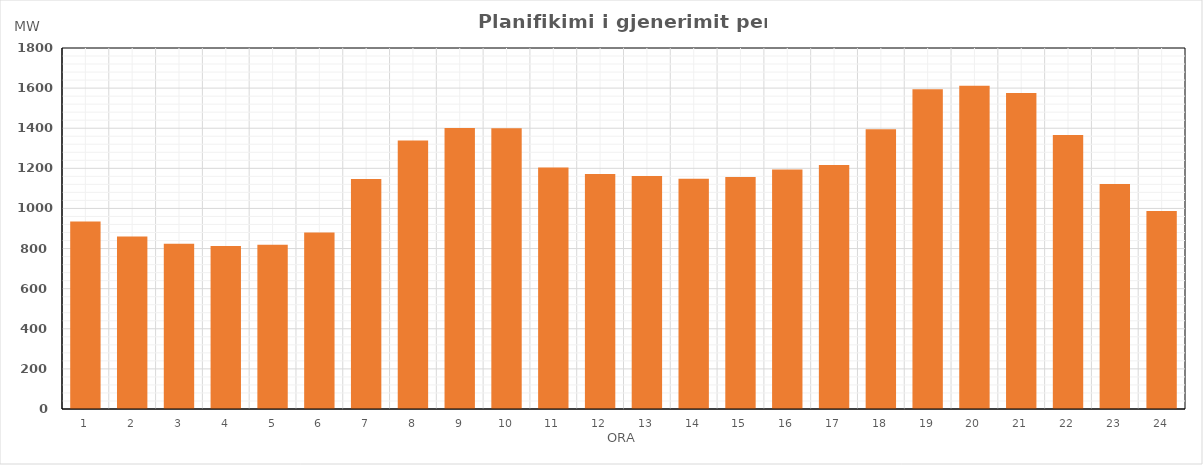
| Category | Max (MW) |
|---|---|
| 0 | 934.54 |
| 1 | 860.58 |
| 2 | 823.58 |
| 3 | 812.58 |
| 4 | 818.57 |
| 5 | 880.61 |
| 6 | 1146.54 |
| 7 | 1338.53 |
| 8 | 1400.61 |
| 9 | 1399.58 |
| 10 | 1203.61 |
| 11 | 1171.6 |
| 12 | 1161.66 |
| 13 | 1147.73 |
| 14 | 1156.7 |
| 15 | 1194.64 |
| 16 | 1216.68 |
| 17 | 1394.7 |
| 18 | 1594.78 |
| 19 | 1611.79 |
| 20 | 1575.78 |
| 21 | 1365.81 |
| 22 | 1121.84 |
| 23 | 986.79 |